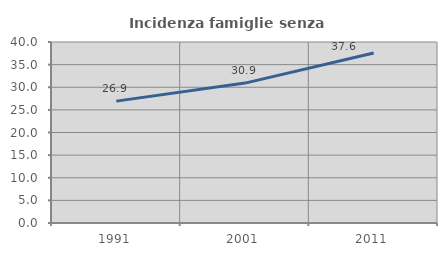
| Category | Incidenza famiglie senza nuclei |
|---|---|
| 1991.0 | 26.936 |
| 2001.0 | 30.916 |
| 2011.0 | 37.556 |